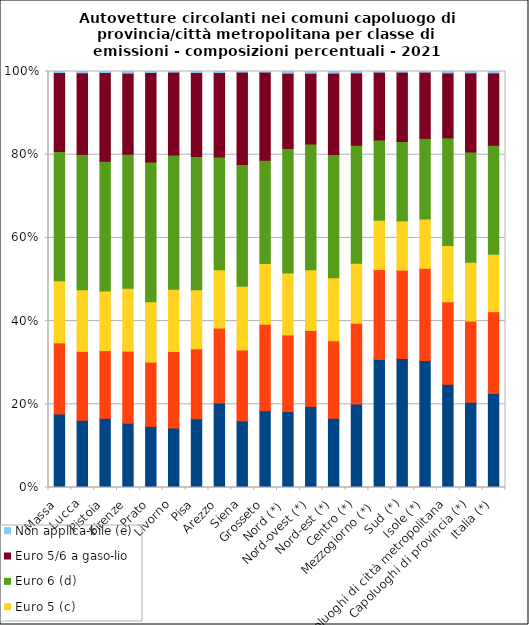
| Category | Euro 3 o infe-riore (a) | Euro 4 (b) | Euro 5 (c)  | Euro 6 (d) | Euro 5/6 a gaso-lio | Non applica-bile (e) |
|---|---|---|---|---|---|---|
| Massa | 21.8 | 21.1 | 18.4 | 38.4 | 23.4 | 0.3 |
| Lucca | 20.1 | 20.6 | 18.4 | 40.5 | 24.4 | 0.4 |
| Pistoia | 21.1 | 20.7 | 18.2 | 39.6 | 27.1 | 0.3 |
| Firenze | 19.2 | 21.5 | 18.8 | 40 | 24.2 | 0.5 |
| Prato | 18.7 | 19.7 | 18.5 | 42.8 | 27.4 | 0.3 |
| Livorno | 17.9 | 22.9 | 18.7 | 40.3 | 24.9 | 0.2 |
| Pisa | 20.7 | 21.1 | 17.8 | 40.2 | 25.3 | 0.3 |
| Arezzo | 25.5 | 22.6 | 17.6 | 34 | 25.5 | 0.3 |
| Siena | 20.6 | 21.9 | 19.7 | 37.6 | 28.5 | 0.2 |
| Grosseto | 23.4 | 26.4 | 18.5 | 31.5 | 26.9 | 0.2 |
| Nord (*)  | 22.3 | 22.5 | 18.2 | 36.6 | 22.1 | 0.5 |
| Nord-ovest (*) | 23.5 | 22 | 17.6 | 36.4 | 20.5 | 0.5 |
| Nord-est (*) | 20.7 | 23.2 | 18.8 | 36.9 | 24.3 | 0.5 |
| Centro (*) | 24.3 | 23.5 | 17.5 | 34.3 | 21.1 | 0.4 |
| Mezzogiorno (*)  | 36.8 | 25.8 | 14.2 | 23 | 19.5 | 0.2 |
| Sud (*) | 37.2 | 25.5 | 14.2 | 22.9 | 20 | 0.2 |
| Isole (*) | 36.3 | 26.3 | 14.1 | 23 | 18.9 | 0.2 |
| Capoluoghi di città metropolitana | 29.4 | 23.5 | 16 | 30.7 | 18.5 | 0.4 |
| Capoluoghi di provincia (*) | 25.3 | 24.1 | 17.5 | 32.7 | 23.5 | 0.4 |
| Italia (*) | 27.3 | 23.8 | 16.7 | 31.7 | 21 | 0.4 |